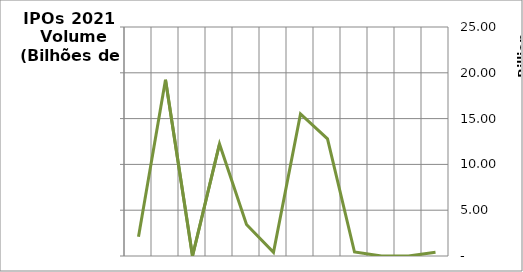
| Category | Volume (R$) |
|---|---|
| Janeiro | 2107326480 |
| Fevereiro | 19235756823.8 |
| Março | 0 |
| Abril | 12229624019.02 |
| Maio | 3447441503.32 |
| Junho | 400400000 |
| Julho | 15502846666.85 |
| Agosto | 12786303440.06 |
| Setembro | 435999996.4 |
| Outubro | 0 |
| Novembro | 0 |
| Dezembro | 405680536 |